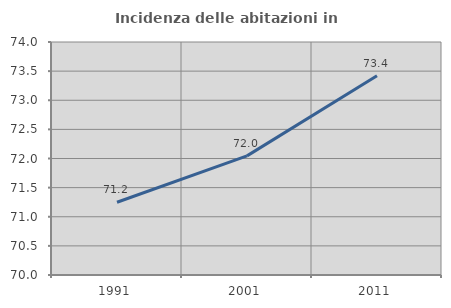
| Category | Incidenza delle abitazioni in proprietà  |
|---|---|
| 1991.0 | 71.248 |
| 2001.0 | 72.045 |
| 2011.0 | 73.422 |